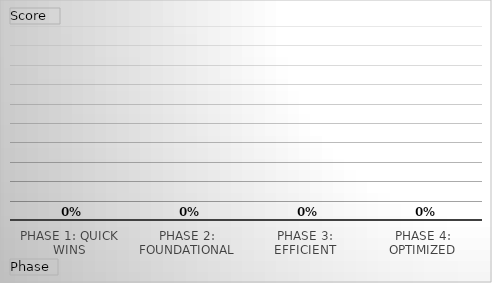
| Category | Total |
|---|---|
| Phase 1: Quick Wins | 0 |
| Phase 2: Foundational | 0 |
| Phase 3: Efficient | 0 |
| Phase 4: Optimized | 0 |